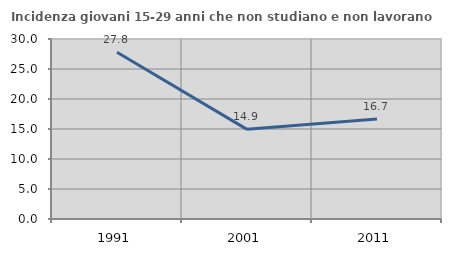
| Category | Incidenza giovani 15-29 anni che non studiano e non lavorano  |
|---|---|
| 1991.0 | 27.802 |
| 2001.0 | 14.943 |
| 2011.0 | 16.667 |